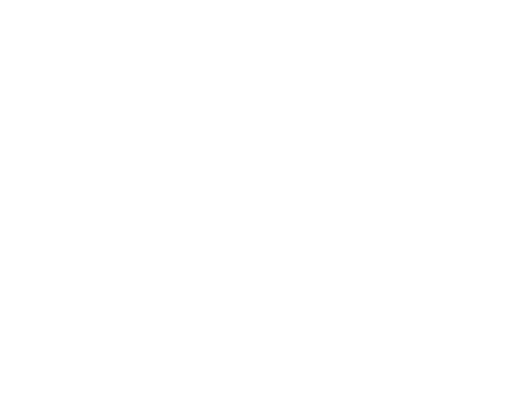
| Category | Series 0 | Series 1 | Series 2 |
|---|---|---|---|
| Impuestos | 1504023.36 | 0.05 |  |
| Cuotas y Aportaciones de Seguridad Social | 0 | 0 |  |
| Contribuciones de Mejoras | 0 | 0 |  |
| Derechos | 1245663.99 | 0.042 |  |
| Productos | 1783.13 | 0 |  |
| Aprovechamientos | 1908632.64 | 0.064 |  |
| Ingresos por Ventas de Bienes y Servicios | 0 | 0 |  |
| Participaciones y Aportaciones | 25158230.8 | 0.844 |  |
| Transferencias, Asignaciones, Subsidios y Otras Ayudas | 0 | 0 |  |
| Ingresos Derivados de Financiamientos | 0 | 0 |  |